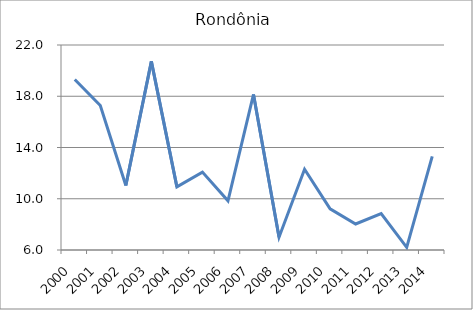
| Category | Rondônia |
|---|---|
| 2000.0 | 19.306 |
| 2001.0 | 17.275 |
| 2002.0 | 11.03 |
| 2003.0 | 20.726 |
| 2004.0 | 10.925 |
| 2005.0 | 12.081 |
| 2006.0 | 9.837 |
| 2007.0 | 18.142 |
| 2008.0 | 7.002 |
| 2009.0 | 12.302 |
| 2010.0 | 9.217 |
| 2011.0 | 8.029 |
| 2012.0 | 8.835 |
| 2013.0 | 6.209 |
| 2014.0 | 13.303 |